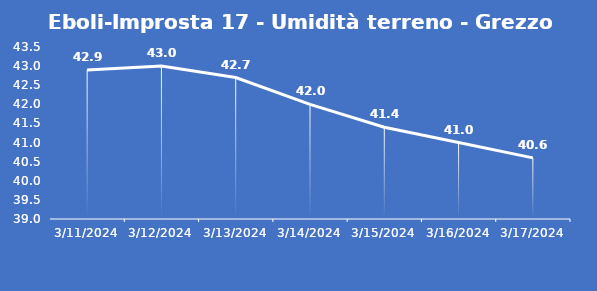
| Category | Eboli-Improsta 17 - Umidità terreno - Grezzo (%VWC) |
|---|---|
| 3/11/24 | 42.9 |
| 3/12/24 | 43 |
| 3/13/24 | 42.7 |
| 3/14/24 | 42 |
| 3/15/24 | 41.4 |
| 3/16/24 | 41 |
| 3/17/24 | 40.6 |